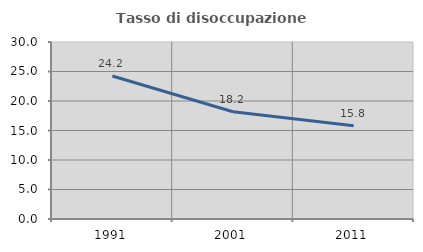
| Category | Tasso di disoccupazione giovanile  |
|---|---|
| 1991.0 | 24.242 |
| 2001.0 | 18.182 |
| 2011.0 | 15.789 |